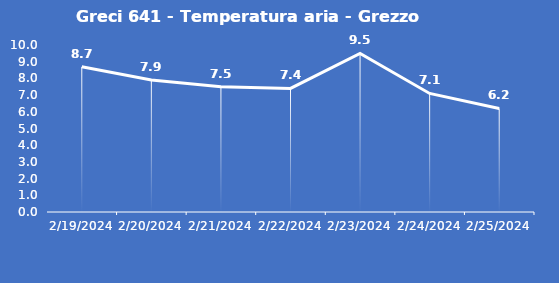
| Category | Greci 641 - Temperatura aria - Grezzo (°C) |
|---|---|
| 2/19/24 | 8.7 |
| 2/20/24 | 7.9 |
| 2/21/24 | 7.5 |
| 2/22/24 | 7.4 |
| 2/23/24 | 9.5 |
| 2/24/24 | 7.1 |
| 2/25/24 | 6.2 |